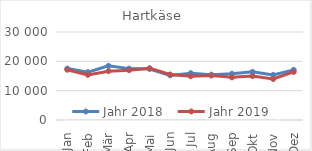
| Category | Jahr 2018 | Jahr 2019 |
|---|---|---|
| Jan | 17531.182 | 17140.206 |
| Feb | 16313.88 | 15387.932 |
| Mär | 18452.158 | 16650.01 |
| Apr | 17517.708 | 16989.036 |
| Mai | 17401.395 | 17660.796 |
| Jun | 15214.59 | 15524.341 |
| Jul | 15971.493 | 14914.028 |
| Aug | 15462.911 | 15165.879 |
| Sep | 15764.913 | 14545.994 |
| Okt | 16407.119 | 14972.519 |
| Nov | 15356.045 | 13977.236 |
| Dez | 17079.718 | 16382.455 |